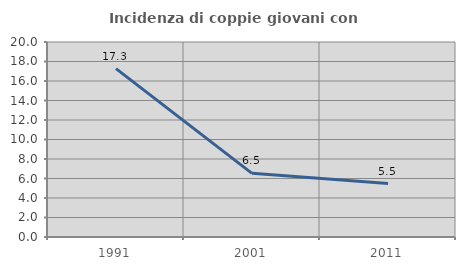
| Category | Incidenza di coppie giovani con figli |
|---|---|
| 1991.0 | 17.273 |
| 2001.0 | 6.532 |
| 2011.0 | 5.482 |